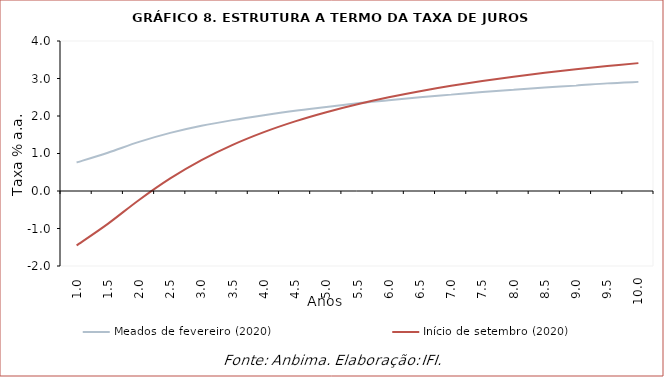
| Category | Meados de fevereiro (2020) | Início de setembro (2020) |
|---|---|---|
| 1.0 | 0.76 | -1.452 |
| 1.5 | 1.02 | -0.876 |
| 2.0 | 1.31 | -0.239 |
| 2.5 | 1.55 | 0.336 |
| 3.0 | 1.74 | 0.824 |
| 3.5 | 1.89 | 1.231 |
| 4.0 | 2.02 | 1.57 |
| 4.5 | 2.14 | 1.857 |
| 5.0 | 2.24 | 2.102 |
| 5.5 | 2.34 | 2.313 |
| 6.0 | 2.42 | 2.497 |
| 6.5 | 2.5 | 2.66 |
| 7.0 | 2.57 | 2.804 |
| 7.5 | 2.64 | 2.933 |
| 8.0 | 2.7 | 3.048 |
| 8.5 | 2.76 | 3.152 |
| 9.0 | 2.81 | 3.246 |
| 9.5 | 2.87 | 3.332 |
| 10.0 | 2.91 | 3.41 |